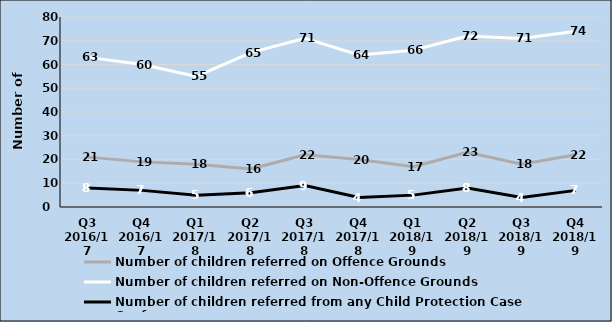
| Category | Number of children referred on Offence Grounds | Number of children referred on Non-Offence Grounds | Number of children referred from any Child Protection Case Conference |
|---|---|---|---|
| Q3 2016/17 | 21 | 63 | 8 |
| Q4 2016/17 | 19 | 60 | 7 |
| Q1 2017/18 | 18 | 55 | 5 |
| Q2 2017/18 | 16 | 65 | 6 |
| Q3 2017/18 | 22 | 71 | 9 |
| Q4 2017/18 | 20 | 64 | 4 |
| Q1 2018/19 | 17 | 66 | 5 |
| Q2 2018/19 | 23 | 72 | 8 |
| Q3 2018/19 | 18 | 71 | 4 |
| Q4 2018/19 | 22 | 74 | 7 |